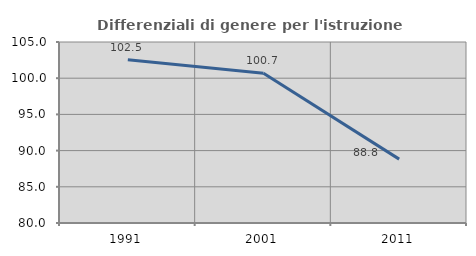
| Category | Differenziali di genere per l'istruzione superiore |
|---|---|
| 1991.0 | 102.534 |
| 2001.0 | 100.67 |
| 2011.0 | 88.82 |